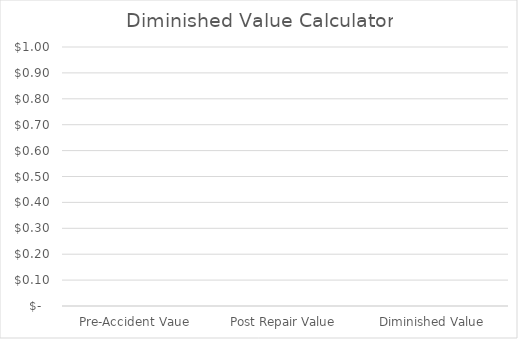
| Category | Series 2 |
|---|---|
| Pre-Accident Vaue | 0 |
| Post Repair Value | 0 |
| Diminished Value | 0 |